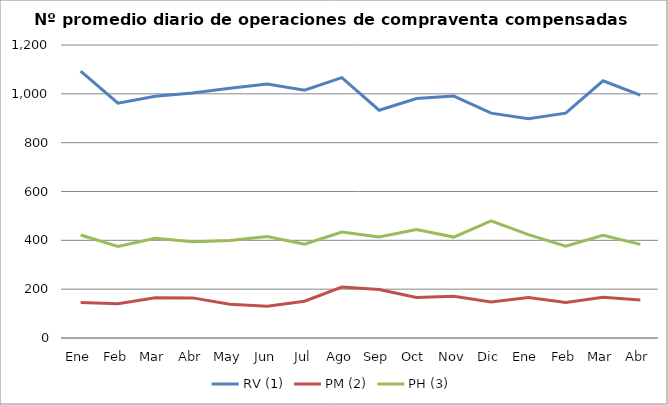
| Category | RV (1) | PM (2) | PH (3) |
|---|---|---|---|
| Ene | 1093.286 | 145.81 | 421.905 |
| Feb | 961.95 | 140.05 | 374.8 |
| Mar | 989.652 | 165.174 | 408.478 |
| Abr | 1003.2 | 164.3 | 394.35 |
| May | 1022.455 | 138.364 | 399.364 |
| Jun | 1040.238 | 130.19 | 415.667 |
| Jul | 1015.19 | 150.429 | 384.571 |
| Ago | 1066.227 | 208.364 | 434.136 |
| Sep | 932.905 | 198.952 | 414.095 |
| Oct | 980.895 | 165.632 | 444.053 |
| Nov | 991 | 170.524 | 413.381 |
| Dic | 920.857 | 147.095 | 480 |
| Ene | 898.5 | 165.591 | 423.273 |
| Feb | 920.762 | 145.429 | 375.667 |
| Mar | 1053.5 | 166.864 | 420.227 |
| Abr | 994.9 | 155.35 | 383.55 |